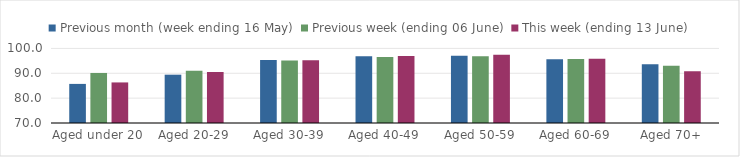
| Category | Previous month (week ending 16 May) | Previous week (ending 06 June) | This week (ending 13 June) |
|---|---|---|---|
| Aged under 20 | 85.729 | 90.129 | 86.321 |
| Aged 20-29 | 89.441 | 91.013 | 90.527 |
| Aged 30-39 | 95.322 | 95.159 | 95.247 |
| Aged 40-49 | 96.849 | 96.504 | 96.907 |
| Aged 50-59 | 97.047 | 96.872 | 97.438 |
| Aged 60-69 | 95.635 | 95.746 | 95.801 |
| Aged 70+ | 93.661 | 93.067 | 90.836 |